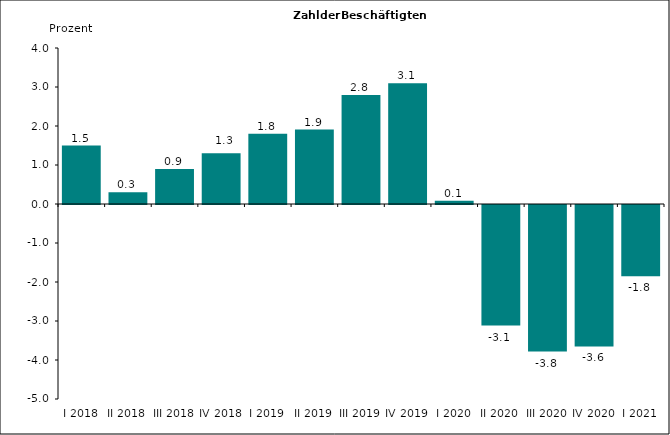
| Category | 1,5 |
|---|---|
| I 2018 | 1.5 |
| II 2018 | 0.3 |
| III 2018 | 0.9 |
| IV 2018 | 1.3 |
| I 2019 | 1.8 |
| II 2019 | 1.91 |
| III 2019 | 2.793 |
| IV 2019 | 3.093 |
| I 2020 | 0.085 |
| II 2020 | -3.091 |
| III 2020 | -3.759 |
| IV 2020 | -3.628 |
| I 2021 | -1.825 |